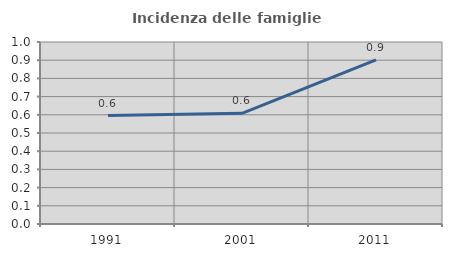
| Category | Incidenza delle famiglie numerose |
|---|---|
| 1991.0 | 0.596 |
| 2001.0 | 0.608 |
| 2011.0 | 0.902 |